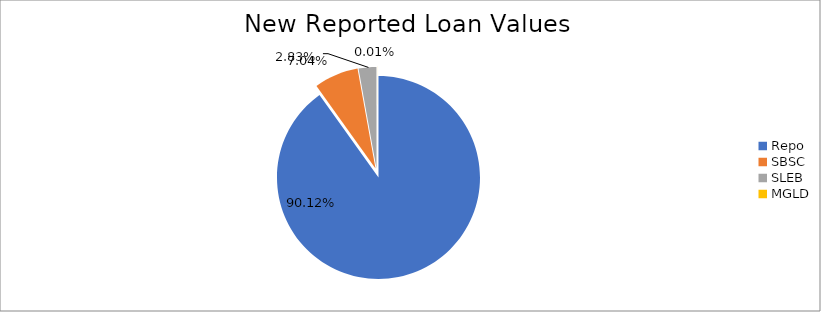
| Category | Series 0 |
|---|---|
| Repo | 11864594.563 |
| SBSC | 927157.334 |
| SLEB | 372423.607 |
| MGLD | 817.35 |